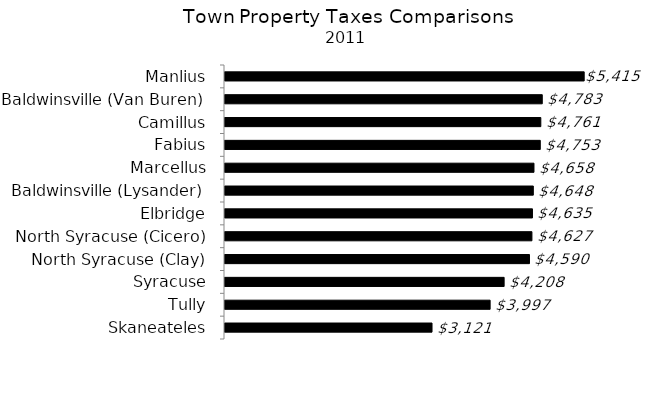
| Category | Series 0 |
|---|---|
| Skaneateles | 3121 |
| Tully | 3997 |
| Syracuse | 4208 |
| North Syracuse (Clay) | 4590 |
| North Syracuse (Cicero) | 4627 |
| Elbridge | 4635 |
| Baldwinsville (Lysander) | 4648 |
| Marcellus | 4658 |
| Fabius | 4753 |
| Camillus | 4761 |
| Baldwinsville (Van Buren) | 4783 |
| Manlius | 5415 |